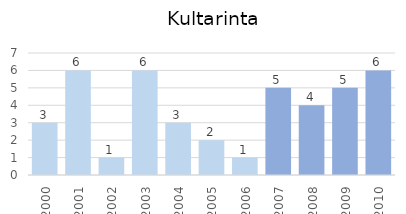
| Category | Series 0 |
|---|---|
| 2000.0 | 3 |
| 2001.0 | 6 |
| 2002.0 | 1 |
| 2003.0 | 6 |
| 2004.0 | 3 |
| 2005.0 | 2 |
| 2006.0 | 1 |
| 2007.0 | 5 |
| 2008.0 | 4 |
| 2009.0 | 5 |
| 2010.0 | 6 |